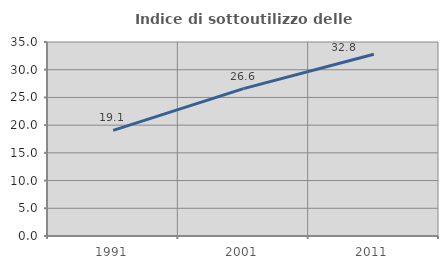
| Category | Indice di sottoutilizzo delle abitazioni  |
|---|---|
| 1991.0 | 19.051 |
| 2001.0 | 26.583 |
| 2011.0 | 32.787 |